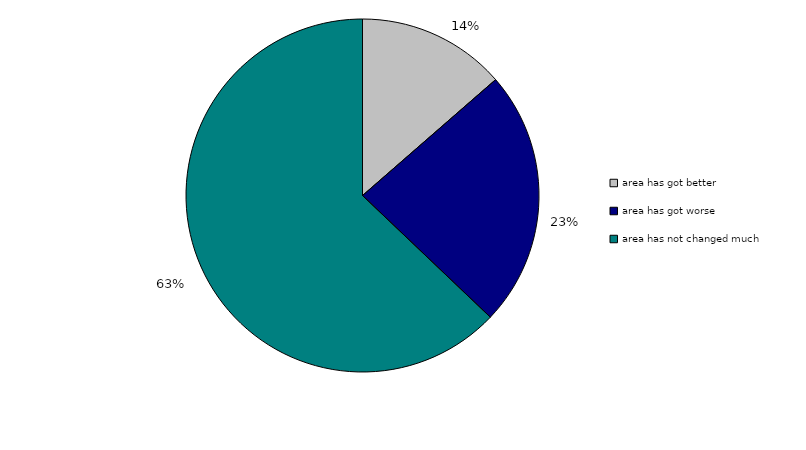
| Category | Series 0 |
|---|---|
| area has got better | 2487.268 |
| area has got worse | 4299.47 |
| area has not changed much | 11503.142 |